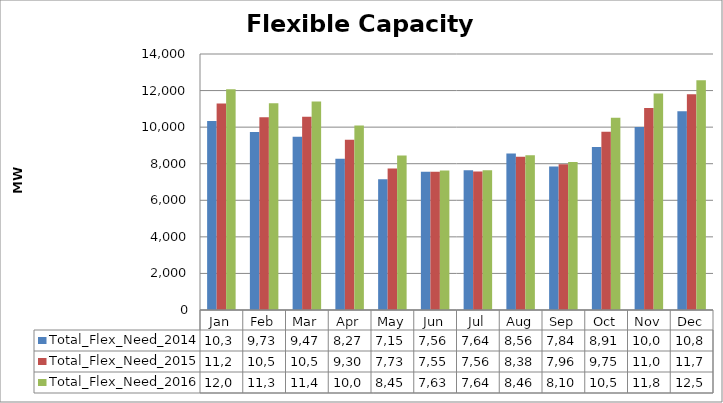
| Category | Total_Flex_Need_2014 | Total_Flex_Need_2015 | Total_Flex_Need_2016 |
|---|---|---|---|
| Jan | 10334.63 | 11296.231 | 12077.355 |
| Feb | 9732.183 | 10538.762 | 11309.783 |
| Mar | 9474.295 | 10570.462 | 11399.662 |
| Apr | 8272.058 | 9305.137 | 10094.894 |
| May | 7151.274 | 7733.927 | 8453.542 |
| Jun | 7562.673 | 7555.621 | 7631.394 |
| Jul | 7646.476 | 7568.355 | 7642.892 |
| Aug | 8562.948 | 8379.581 | 8459.923 |
| Sep | 7841.305 | 7963.961 | 8100.135 |
| Oct | 8916.495 | 9754.421 | 10514.825 |
| Nov | 10007.384 | 11041.87 | 11839.385 |
| Dec | 10868.789 | 11795.709 | 12560.267 |